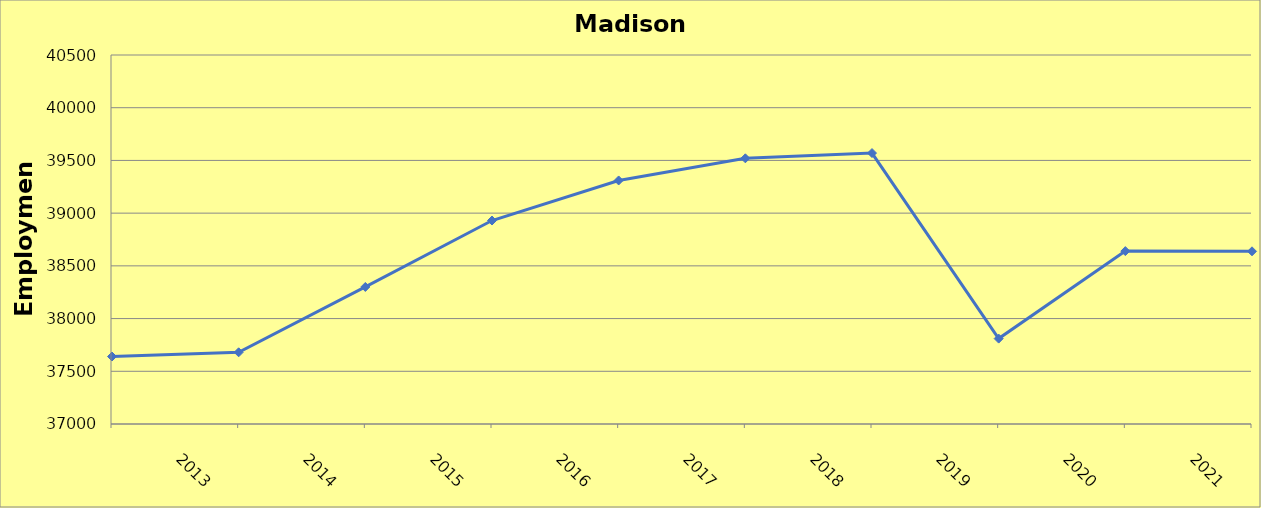
| Category | Madison County |
|---|---|
| 2013.0 | 37640 |
| 2014.0 | 37680 |
| 2015.0 | 38300 |
| 2016.0 | 38930 |
| 2017.0 | 39310 |
| 2018.0 | 39520 |
| 2019.0 | 39570 |
| 2020.0 | 37810 |
| 2021.0 | 38640 |
| 2022.0 | 38638 |